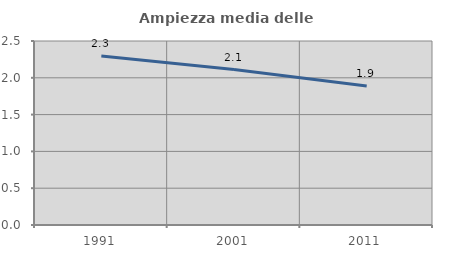
| Category | Ampiezza media delle famiglie |
|---|---|
| 1991.0 | 2.296 |
| 2001.0 | 2.112 |
| 2011.0 | 1.889 |